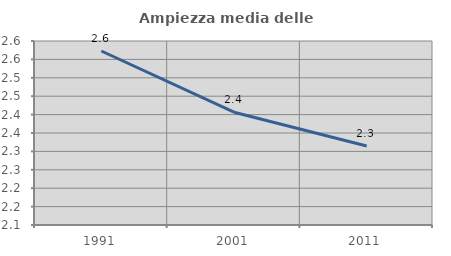
| Category | Ampiezza media delle famiglie |
|---|---|
| 1991.0 | 2.573 |
| 2001.0 | 2.406 |
| 2011.0 | 2.315 |